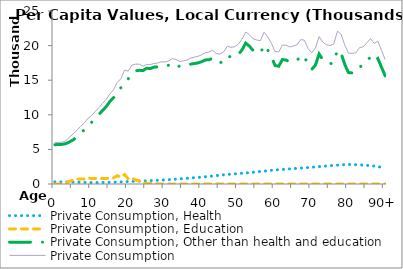
| Category | Private Consumption, Health | Private Consumption, Education | Private Consumption, Other than health and education | Private Consumption |
|---|---|---|---|---|
| 0 | 310.582 | 0 | 5680.367 | 5990.949 |
|  | 308.274 | 0 | 5704.346 | 6012.621 |
| 2 | 305.967 | 0 | 5728.326 | 6034.292 |
| 3 | 301.94 | 117.119 | 5830.524 | 6249.582 |
| 4 | 293.152 | 394.77 | 6083.768 | 6771.69 |
| 5 | 284.21 | 570.198 | 6381.103 | 7235.511 |
| 6 | 271.001 | 673.211 | 6785.572 | 7729.784 |
| 7 | 252.567 | 739.822 | 7334.71 | 8327.099 |
| 8 | 233.474 | 726.654 | 7820.097 | 8780.224 |
| 9 | 221.087 | 916.606 | 8352.294 | 9489.986 |
| 10 | 211.585 | 768.098 | 8896.234 | 9875.917 |
| 11 | 204.784 | 813.283 | 9455.073 | 10473.139 |
| 12 | 207.464 | 776.632 | 10041.906 | 11026.003 |
| 13 | 215.763 | 809.621 | 10628.625 | 11654.01 |
| 14 | 226.099 | 804.56 | 11183.37 | 12214.03 |
| 15 | 238.889 | 836.451 | 11929.02 | 13004.359 |
| 16 | 259.811 | 882.074 | 12468.618 | 13610.504 |
| 17 | 282.482 | 1197.868 | 13202.675 | 14683.025 |
| 18 | 303.934 | 993.444 | 13918.484 | 15215.862 |
| 19 | 328.102 | 1365.861 | 14772.644 | 16466.606 |
| 20 | 352.865 | 751.692 | 15204.889 | 16309.446 |
| 21 | 373.347 | 867.373 | 15924.851 | 17165.571 |
| 22 | 390.573 | 578.765 | 16353.889 | 17323.226 |
| 23 | 412.167 | 467.722 | 16429.605 | 17309.494 |
| 24 | 431.959 | 209.931 | 16382.944 | 17024.835 |
| 25 | 453.555 | 77.56 | 16735.085 | 17266.199 |
| 26 | 478.714 | 101.979 | 16670.001 | 17250.694 |
| 27 | 507.135 | 33.581 | 16888.312 | 17429.027 |
| 28 | 531.979 | 23.605 | 16917.677 | 17473.261 |
| 29 | 559.285 | 0 | 17108.833 | 17668.118 |
| 30 | 589.856 | 0 | 17037.881 | 17627.737 |
| 31 | 623.885 | 0 | 17154.216 | 17778.101 |
| 32 | 659.945 | 0 | 17465.858 | 18125.803 |
| 33 | 699.104 | 0 | 17292.33 | 17991.434 |
| 34 | 740.362 | 0 | 16964.855 | 17705.217 |
| 35 | 781.883 | 0 | 17011.048 | 17792.931 |
| 36 | 822.189 | 0 | 17090.739 | 17912.928 |
| 37 | 866.298 | 0 | 17316.514 | 18182.812 |
| 38 | 909.867 | 0 | 17413.804 | 18323.671 |
| 39 | 950.631 | 0 | 17497.066 | 18447.697 |
| 40 | 994.552 | 0 | 17677.618 | 18672.171 |
| 41 | 1044.797 | 0 | 17921.67 | 18966.467 |
| 42 | 1100.271 | 0 | 17963.671 | 19063.943 |
| 43 | 1156.706 | 0 | 18164.235 | 19320.941 |
| 44 | 1216.553 | 0 | 17623.953 | 18840.506 |
| 45 | 1275.961 | 0 | 17502.423 | 18778.384 |
| 46 | 1324.591 | 0 | 17782.079 | 19106.671 |
| 47 | 1370.61 | 0 | 18531.185 | 19901.795 |
| 48 | 1415.973 | 0 | 18330.666 | 19746.639 |
| 49 | 1463.468 | 0 | 18376.815 | 19840.283 |
| 50 | 1504.934 | 0 | 18714.117 | 20219.051 |
| 51 | 1548.169 | 0 | 19377.744 | 20925.913 |
| 52 | 1594.121 | 0 | 20370.024 | 21964.146 |
| 53 | 1640.933 | 0 | 19924.257 | 21565.19 |
| 54 | 1694.167 | 0 | 19302.89 | 20997.057 |
| 55 | 1752.376 | 0 | 19060.023 | 20812.399 |
| 56 | 1807.7 | 0 | 18895.458 | 20703.158 |
| 57 | 1862.455 | 0 | 20073.228 | 21935.683 |
| 58 | 1917.035 | 0 | 19352.604 | 21269.639 |
| 59 | 1975.926 | 0 | 18355.805 | 20331.731 |
| 60 | 2022.08 | 0 | 17131.711 | 19153.79 |
| 61 | 2065.287 | 0 | 17013.512 | 19078.799 |
| 62 | 2104.163 | 0 | 17982.15 | 20086.313 |
| 63 | 2144.658 | 0 | 17907.131 | 20051.789 |
| 64 | 2189.527 | 0 | 17618.09 | 19807.617 |
| 65 | 2233.972 | 0 | 17720.201 | 19954.173 |
| 66 | 2267.589 | 0 | 17851.572 | 20119.161 |
| 67 | 2300.224 | 0 | 18571.875 | 20872.099 |
| 68 | 2340.502 | 0 | 18439.43 | 20779.932 |
| 69 | 2373.553 | 0 | 17179.538 | 19553.091 |
| 70 | 2417.932 | 0 | 16556.557 | 18974.489 |
| 71 | 2462.599 | 0 | 17185.006 | 19647.606 |
| 72 | 2507.853 | 0 | 18790.318 | 21298.171 |
| 73 | 2553.353 | 0 | 17954.905 | 20508.258 |
| 74 | 2598.2 | 0 | 17529.041 | 20127.242 |
| 75 | 2642.725 | 0 | 17371.37 | 20014.096 |
| 76 | 2682.946 | 0 | 17531.216 | 20214.162 |
| 77 | 2723.309 | 0 | 19366.26 | 22089.569 |
| 78 | 2759.573 | 0 | 18863.732 | 21623.305 |
| 79 | 2799.791 | 0 | 17261.66 | 20061.452 |
| 80 | 2820.797 | 0 | 16094.976 | 18915.773 |
| 81 | 2814.174 | 0 | 16055.005 | 18869.179 |
| 82 | 2789.914 | 0 | 16165.267 | 18955.181 |
| 83 | 2759.355 | 0 | 16940.125 | 19699.48 |
| 84 | 2731.71 | 0 | 17101.16 | 19832.87 |
| 85 | 2697.766 | 0 | 17689.757 | 20387.523 |
| 86 | 2644.648 | 0 | 18378.56 | 21023.208 |
| 87 | 2581.64 | 0 | 17744.216 | 20325.856 |
| 88 | 2506.285 | 0 | 18141.531 | 20647.817 |
| 89 | 2428.561 | 0 | 16887.239 | 19315.8 |
| 90+ | 2350.836 | 0 | 15632.947 | 17983.783 |